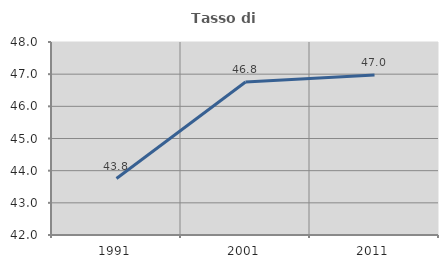
| Category | Tasso di occupazione   |
|---|---|
| 1991.0 | 43.755 |
| 2001.0 | 46.757 |
| 2011.0 | 46.971 |